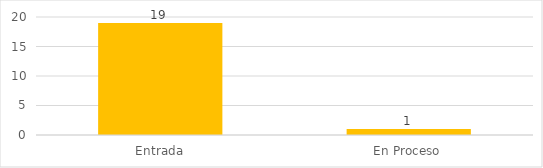
| Category | Series 0 |
|---|---|
| Entrada | 19 |
| En Proceso | 1 |